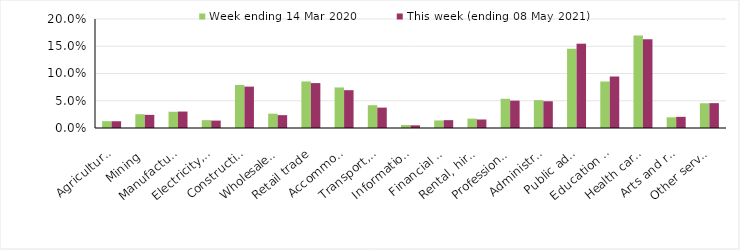
| Category | Week ending 14 Mar 2020 | This week (ending 08 May 2021) |
|---|---|---|
| Agriculture, forestry and fishing | 0.012 | 0.012 |
| Mining | 0.025 | 0.024 |
| Manufacturing | 0.03 | 0.03 |
| Electricity, gas, water and waste services | 0.014 | 0.014 |
| Construction | 0.079 | 0.076 |
| Wholesale trade | 0.026 | 0.024 |
| Retail trade | 0.085 | 0.082 |
| Accommodation and food services | 0.074 | 0.069 |
| Transport, postal and warehousing | 0.042 | 0.037 |
| Information media and telecommunications | 0.006 | 0.005 |
| Financial and insurance services | 0.014 | 0.014 |
| Rental, hiring and real estate services | 0.017 | 0.016 |
| Professional, scientific and technical services | 0.054 | 0.05 |
| Administrative and support services | 0.051 | 0.049 |
| Public administration and safety | 0.145 | 0.155 |
| Education and training | 0.085 | 0.094 |
| Health care and social assistance | 0.17 | 0.163 |
| Arts and recreation services | 0.02 | 0.02 |
| Other services | 0.045 | 0.046 |